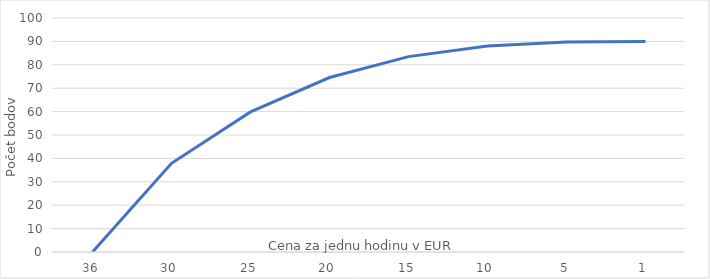
| Category | Series 0 |
|---|---|
| 36.0 | 0 |
| 30.0 | 37.917 |
| 25.0 | 59.859 |
| 20.0 | 74.568 |
| 15.0 | 83.49 |
| 10.0 | 88.071 |
| 5.0 | 89.759 |
| 1.0 | 89.998 |